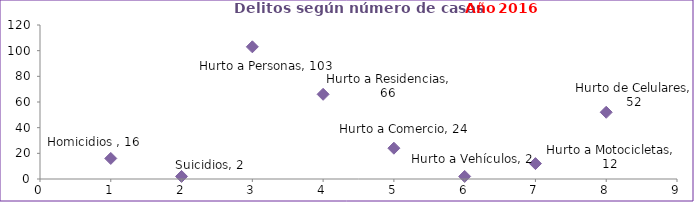
| Category | Series 0 |
|---|---|
| 0 | 16 |
| 1 | 2 |
| 2 | 103 |
| 3 | 66 |
| 4 | 24 |
| 5 | 2 |
| 6 | 12 |
| 7 | 52 |